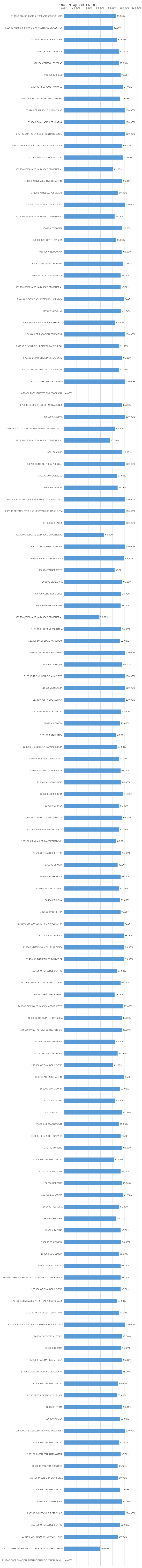
| Category | Series 0 |
|---|---|
| 010100 COMUNICACION Y RELACIONES PUBLICAS | 0.85 |
| 010600 ANALISIS FINANCIERO Y CONTROL DE GESTION | 0.8 |
| 011500 OFICINA DE RECTORIA | 0.87 |
| 020100 ARCHIVO GENERAL | 0.91 |
| 020200 CONTROL ESCOLAR | 0.9 |
| 020300 JURIDICO | 0.93 |
| 020400 RECURSOS HUMANOS | 0.97 |
| 021500 OFICINA DE SECRETARIA GENERAL | 0.92 |
| 030200 DESARROLLO CURRICULAR | 1 |
| 030300 EVALUACION EDUCATIVA | 1 |
| 030400 CONTROL Y SEGUIMIENTO DOCENTE | 1 |
| 030900 FORMACION Y ACTUALIZACION ACADEMICA | 0.96 |
| 031000 INNOVACION EDUCATIVA | 0.97 |
| 031500 OFICINA DE LA DIRECCION GENERAL  | 0.81 |
| 040100 APOYO A LA INVESTIGACION  | 0.96 |
| 040200 APOYO AL POSGRADO | 0.89 |
| 040400 INTERCAMBIO ACADEMICO | 1 |
| 041500 OFICINA DE LA DIRECCION GENERAL  | 0.83 |
| 050200 EDITORIAL | 0.96 |
| 050300 RADIO Y TELEVISION | 0.85 |
| 050400 VINCULACION | 0.96 |
| 050600 DIFUSION CULTURAL | 0.97 |
| 050700 EXTENSION ACADEMICA | 0.93 |
| 051500 OFICINA DE LA DIRECCION GENERAL  | 0.93 |
| 060100 APOYO A LA FORMACION INTEGRAL | 0.98 |
| 060200 DEPORTES | 0.94 |
| 060300 INFORMACION BIBLIOGRAFICA | 0.84 |
| 060400 ORIENTACION EDUCATIVA | 1 |
| 061500 OFICINA DE LA DIRECCION GENERAL | 0.91 |
| 070100 ESTADISTICA INSTITUCIONAL  | 0.96 |
| 070200 PROYECTOS INSTITUCIONALES | 0.9 |
| 070300 GESTION DE CALIDAD | 1 |
| 070400 PRESUPUESTO POR PROGRAMA | 0 |
| 070500 REDES Y TELECOMUNICACIONES | 0.95 |
| 070600 SISTEMAS | 1 |
| 070700 EVALUACION DEL DESEMPEÑO PRESUPUESTAL | 0.84 |
| 071500 OFICINA DE LA DIRECCION GENERAL  | 0.75 |
| 080100 CAJAS | 0.96 |
| 080200 CONTROL PRESUPUESTAL  | 1 |
| 080300 CONTABILIDAD | 0.87 |
| 080400 COMPRAS | 0.88 |
| 080500 CONTROL DE BIENES MUEBLES E INMUEBLES | 1 |
| 080700 PRESUPUESTO Y ADMINISTRACION FINANCIERA | 1 |
| 081400 JUBILADOS | 1 |
| 081500 OFICINA DE LA DIRECCION GENERAL  | 0.66 |
| 090300 PROCESOS GRAFICOS | 1 |
| 090400 SERVICIOS GENERALES | 0.99 |
| 090500 TRANSPORTES | 0.83 |
| 090600 VIGILANCIA | 0.96 |
| 090700 CONSTRUCCIONES | 0.94 |
| 090800 MANTENIMIENTO  | 0.93 |
| 091500 OFICINA DE LA DIRECCION GENERAL  | 0.58 |
| 110100 CLINICA VETERINARIA | 0.94 |
| 110200 DISCIPLINAS AGRICOLAS | 0.92 |
| 110300 DISCIPLINAS PECUARIAS | 1 |
| 110400 FITOTECNIA | 0.96 |
| 110500 TECNOLOGIA DE ALIMENTOS | 1 |
| 110600 ZOOTECNIA | 1 |
| 111400 POSTA ZOOTECNICA | 1 |
| 111500 OFICINA DE CENTRO | 0.94 |
| 120100 BIOLOGIA | 0.92 |
| 120200 ESTADISTICA | 0.86 |
| 120300 FISIOLOGIA Y FARMACOLOGIA | 0.87 |
| 120400 INGENIERIA BIOQUIMICA | 0.9 |
| 120500 MATEMATICAS Y FISICA | 0.93 |
| 120600 MICROBIOLOGIA | 0.94 |
| 120700 MORFOLOGIA | 0.97 |
| 120800 QUIMICA | 0.91 |
| 120900 SISTEMAS DE INFORMACION | 0.96 |
| 121000 SISTEMAS ELECTRONICOS | 0.9 |
| 121100 CIENCIAS DE LA COMPUTACION | 0.86 |
| 121500 OFICINA DEL CENTRO | 0.94 |
| 130100 CIRUGIA | 0.88 |
| 130200 ENFERMERIA  | 0.93 |
| 130300 ESTOMATOLOGIA | 0.9 |
| 130400 MEDICINA | 0.92 |
| 130500 OPTOMETRIA | 0.93 |
| 130600 GINECO-OBSTETRICIA Y PEDIATRIA | 0.98 |
| 130700 SALUD PUBLICA | 0.98 |
| 130800 NUTRICION Y CULTURA FISICA | 0.99 |
| 131400 UNIDAD MEDICO DIDACTICA | 0.99 |
| 131500 OFICINA DEL CENTRO | 0.87 |
| 140100 CONSTRUCCION Y ESTRUCTURAS | 0.93 |
| 140200 DISEÑO DEL HABITAT | 0.83 |
| 140300 DISEÑO DE IMAGEN Y PRODUCTOS | 0.97 |
| 140400 GEOTECNIA E HIDRAULICA | 0.95 |
| 140500 MANUFACTURA DE PROTOTIPOS | 0.95 |
| 140600 REPRESENTACION | 0.84 |
| 140700 TEORIA Y METODOS | 0.88 |
| 141500 OFICINA DEL CENTRO | 0.81 |
| 150100 ADMINISTRACION  | 0.98 |
| 150200 CONTADURIA | 0.92 |
| 150300 ECONOMIA | 0.84 |
| 150400 FINANZAS | 0.95 |
| 150500 MERCADOTECNIA | 0.9 |
| 150600 RECURSOS HUMANOS | 0.93 |
| 150700 TURISMO | 0.96 |
| 151500 OFICINA DEL CENTRO | 0.82 |
| 160100 COMUNICACION | 0.93 |
| 160200 DERECHO | 0.95 |
| 160300 EDUCACION | 0.97 |
| 160400 FILOSOFIA | 0.91 |
| 160500 HISTORIA | 0.86 |
| 160600 IDIOMAS | 0.93 |
| 160800 PSICOLOGIA | 0.94 |
| 160900 SOCIOLOGIA | 0.9 |
| 161000 TRABAJO SOCIAL | 0.93 |
| 161100 CIENCIAS POLITICAS Y ADMINISTRACION PUBLICA | 0.93 |
| 161500 OFICINA DEL CENTRO | 0.93 |
| 170100 ACTIVIDADES ARTISTICAS Y CULTURALES | 0.87 |
| 170200 ACTIVIDADES DEPORTIVAS | 0.9 |
| 170400 CIENCIAS SOCIALES,ECONOMICAS E HISTORIA | 1 |
| 170500 FILOSOFIA Y LETRAS | 0.95 |
| 170700 IDIOMAS | 0.94 |
| 170800 MATEMATICAS Y FISICA | 0.96 |
| 170900 CIENCIAS QUIMICO-BIOLOGICAS | 0.95 |
| 171500 OFICINA DEL CENTRO | 0.89 |
| 180100 ARTE Y GESTION CULTURAL | 0.87 |
| 180200 LETRAS | 0.96 |
| 180300 MUSICA | 0.92 |
| 180500 ARTES ESCENICAS Y AUDIOVISUALES | 1 |
| 181500 OFICINA DEL CENTRO | 0.91 |
| 190200 INGENIERIA AUTOMOTRIZ | 0.93 |
| 190300 INGENIERIA ROBOTICA | 0.88 |
| 190400 INGENIERIA BIOMEDICA | 0.89 |
| 191500 OFICINA DEL CENTRO | 0.92 |
| 200200 AGRONEGOCIOS | 0.95 |
| 200300 COMERCIO ELECTRONICO | 1 |
| 201500 OFICINA DEL CENTRO | 0.92 |
| 210100 CONTRALORIA  UNIVERSITARIA | 0.89 |
| 220100 DEFENSORIA DE LOS DERECHOS UNIVERSITARIOS | 0.59 |
| 230100 COORDINACION INSTITUCIONAL DE  VINCULACION | 0 |